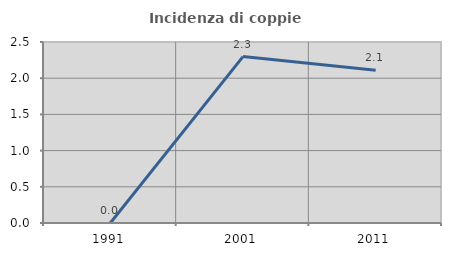
| Category | Incidenza di coppie miste |
|---|---|
| 1991.0 | 0 |
| 2001.0 | 2.299 |
| 2011.0 | 2.111 |